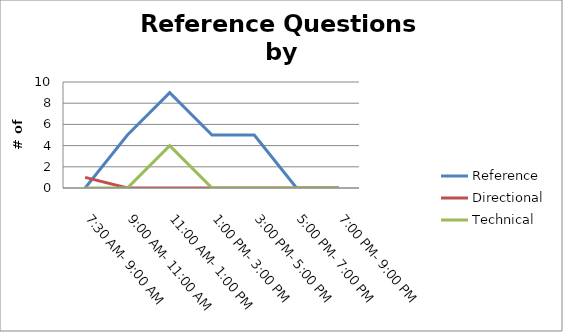
| Category | Reference | Directional | Technical |
|---|---|---|---|
| 7:30 AM- 9:00 AM | 0 | 1 | 0 |
| 9:00 AM- 11:00 AM | 5 | 0 | 0 |
| 11:00 AM- 1:00 PM | 9 | 0 | 4 |
| 1:00 PM- 3:00 PM | 5 | 0 | 0 |
| 3:00 PM- 5:00 PM | 5 | 0 | 0 |
| 5:00 PM- 7:00 PM | 0 | 0 | 0 |
| 7:00 PM- 9:00 PM | 0 | 0 | 0 |